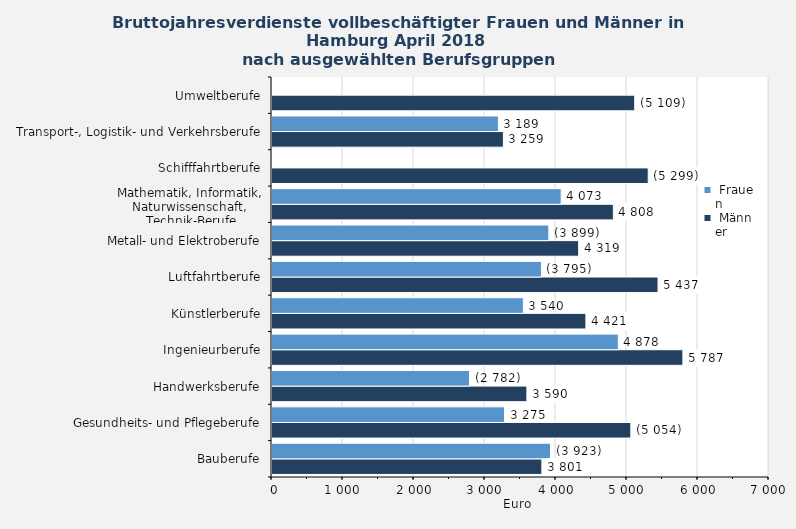
| Category |  Männer |  Frauen |
|---|---|---|
| Bauberufe | 3801 | 3923 |
| Gesundheits- und Pflegeberufe | 5054 | 3275 |
| Handwerksberufe | 3590 | 2782 |
| Ingenieurberufe | 5787 | 4878 |
| Künstlerberufe | 4421 | 3540 |
| Luftfahrtberufe | 5437 | 3795 |
| Metall- und Elektroberufe | 4319 | 3899 |
| Mathematik, Informatik, Naturwissenschaft,
 Technik-Berufe | 4808 | 4073 |
| Schifffahrtberufe | 5299 | 0 |
| Transport-, Logistik- und Verkehrsberufe | 3259 | 3189 |
| Umweltberufe | 5109 | 0 |